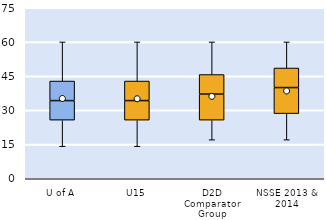
| Category | 25th | 50th | 75th |
|---|---|---|---|
| U of A | 25.714 | 8.571 | 8.571 |
| U15 | 25.714 | 8.571 | 8.571 |
| D2D Comparator Group | 25.714 | 11.429 | 8.571 |
| NSSE 2013 & 2014 | 28.571 | 11.429 | 8.571 |